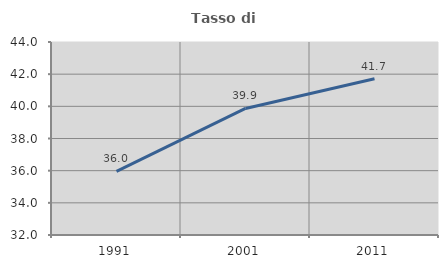
| Category | Tasso di occupazione   |
|---|---|
| 1991.0 | 35.955 |
| 2001.0 | 39.869 |
| 2011.0 | 41.71 |